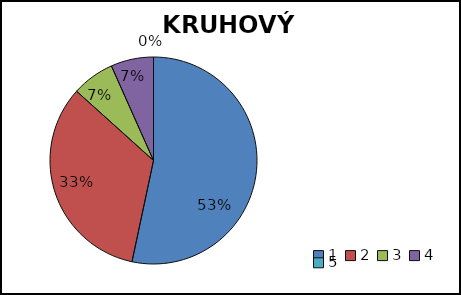
| Category | Počet žiakov |
|---|---|
| 0 | 8 |
| 1 | 5 |
| 2 | 1 |
| 3 | 1 |
| 4 | 0 |